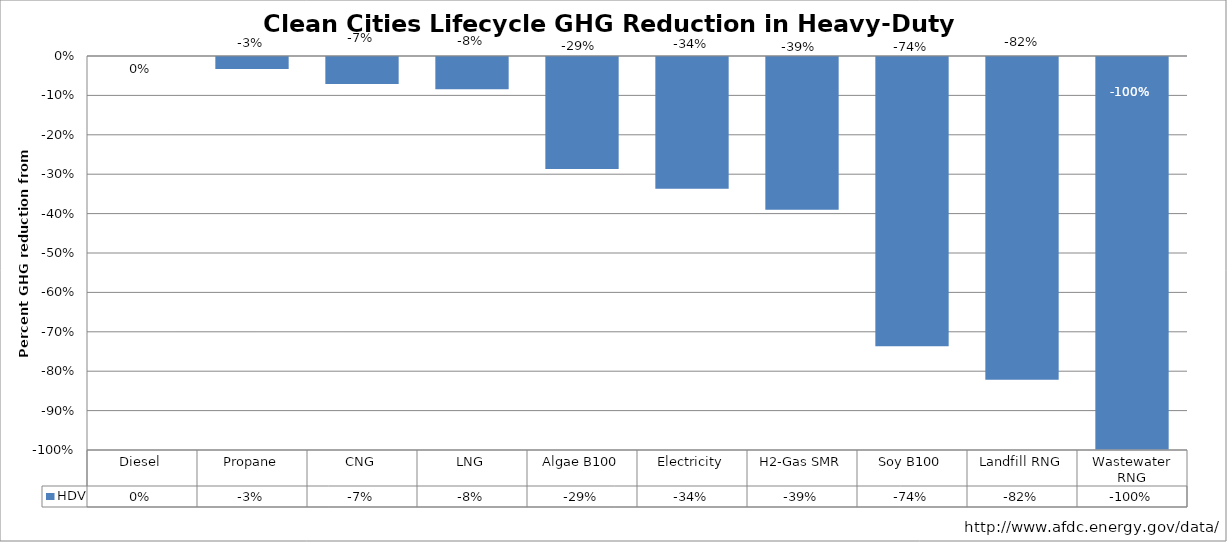
| Category | HDV |
|---|---|
| Diesel | 0 |
| Propane | -0.033 |
| CNG | -0.071 |
| LNG | -0.084 |
| Algae B100 | -0.287 |
| Electricity | -0.337 |
| H2-Gas SMR | -0.39 |
| Soy B100 | -0.737 |
| Landfill RNG | -0.822 |
| Wastewater RNG | -0.999 |